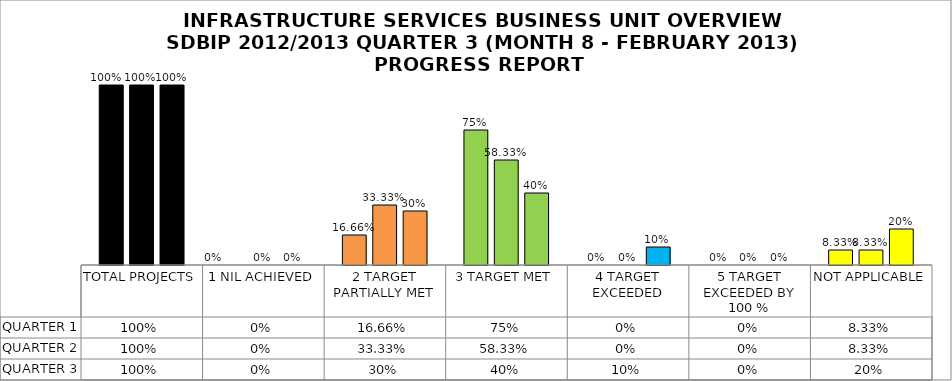
| Category | QUARTER 1 | QUARTER 2 | QUARTER 3 |
|---|---|---|---|
| TOTAL PROJECTS | 1 | 1 | 1 |
| 1 NIL ACHIEVED | 0 | 0 | 0 |
| 2 TARGET PARTIALLY MET | 0.167 | 0.333 | 0.3 |
| 3 TARGET MET | 0.75 | 0.583 | 0.4 |
| 4 TARGET EXCEEDED | 0 | 0 | 0.1 |
| 5 TARGET EXCEEDED BY 100 % | 0 | 0 | 0 |
| NOT APPLICABLE | 0.083 | 0.083 | 0.2 |